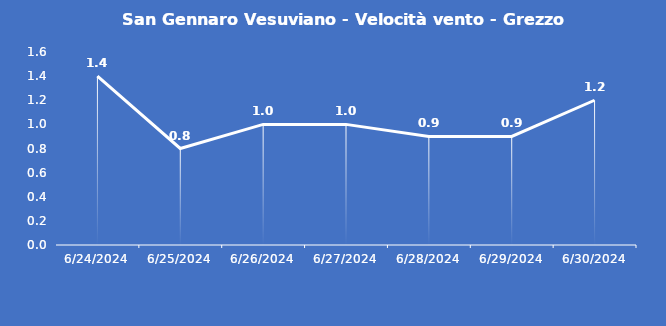
| Category | San Gennaro Vesuviano - Velocità vento - Grezzo (m/s) |
|---|---|
| 6/24/24 | 1.4 |
| 6/25/24 | 0.8 |
| 6/26/24 | 1 |
| 6/27/24 | 1 |
| 6/28/24 | 0.9 |
| 6/29/24 | 0.9 |
| 6/30/24 | 1.2 |